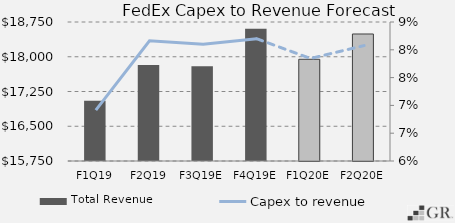
| Category | Total Revenue |
|---|---|
|  F1Q19  | 17052 |
|  F2Q19  | 17824 |
|  F3Q19E  | 17794.096 |
|  F4Q19E  | 18603.576 |
|  F1Q20E  | 17945.64 |
|  F2Q20E  | 18491.232 |